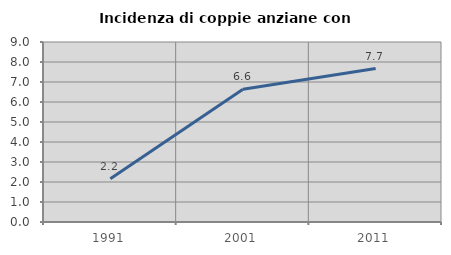
| Category | Incidenza di coppie anziane con figli |
|---|---|
| 1991.0 | 2.16 |
| 2001.0 | 6.636 |
| 2011.0 | 7.673 |